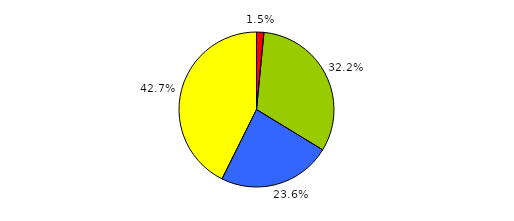
| Category | Series 0 |
|---|---|
| 0 | 16 |
| 1 | 335 |
| 2 | 246 |
| 3 | 444 |